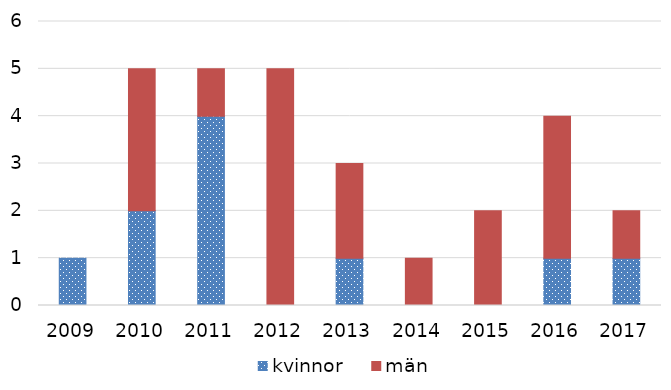
| Category | kvinnor | män |
|---|---|---|
| 2009 | 1 | 0 |
| 2010 | 2 | 3 |
| 2011 | 4 | 1 |
| 2012 | 0 | 5 |
| 2013 | 1 | 2 |
| 2014 | 0 | 1 |
| 2015 | 0 | 2 |
| 2016 | 1 | 3 |
| 2017 | 1 | 1 |